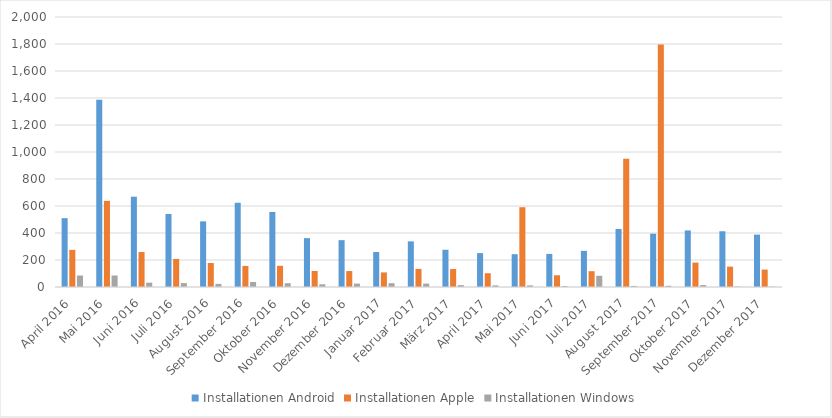
| Category | Installationen Android | Installationen Apple | Installationen Windows |
|---|---|---|---|
| April 2016 | 510 | 275 | 85 |
| Mai 2016 | 1387 | 638 | 85 |
| Juni 2016 | 669 | 259 | 32 |
| Juli 2016 | 541 | 208 | 29 |
| August 2016 | 486 | 178 | 23 |
| September 2016 | 624 | 156 | 37 |
| Oktober 2016 | 556 | 157 | 28 |
| November 2016 | 362 | 119 | 20 |
| Dezember 2016 | 347 | 118 | 25 |
| Januar 2017 | 259 | 108 | 28 |
| Februar 2017 | 338 | 134 | 25 |
| März 2017 | 276 | 133 | 14 |
| April 2017 | 251 | 102 | 12 |
| Mai 2017 | 243 | 591 | 12 |
| Juni 2017 | 245 | 87 | 7 |
| Juli 2017 | 268 | 117 | 83 |
| August 2017 | 430 | 950 | 8 |
| September 2017 | 395 | 1797 | 9 |
| Oktober 2017 | 419 | 181 | 14 |
| November 2017 | 413 | 151 | 3 |
| Dezember 2017 | 388 | 129 | 3 |